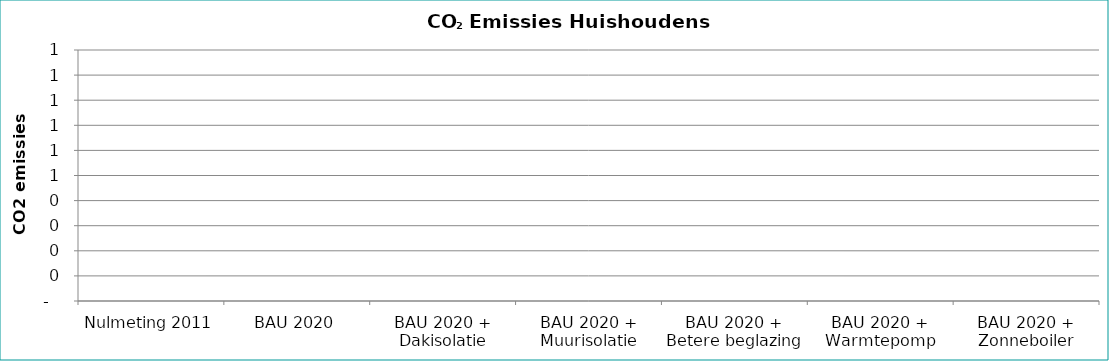
| Category | Series 0 |
|---|---|
| Nulmeting 2011 | 0 |
| BAU 2020 | 0 |
| BAU 2020 + Dakisolatie | 0 |
| BAU 2020 + Muurisolatie | 0 |
| BAU 2020 + Betere beglazing | 0 |
| BAU 2020 + Warmtepomp | 0 |
| BAU 2020 + Zonneboiler | 0 |